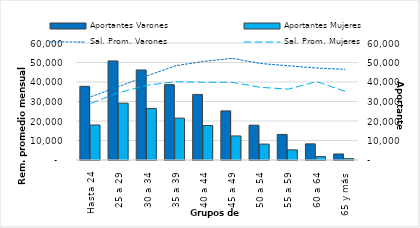
| Category | Aportantes Varones | Aportantes Mujeres |
|---|---|---|
| Hasta 24 | 37773 | 17953 |
| 25 a 29 | 50815 | 29146 |
| 30 a 34 | 46172 | 26453 |
| 35 a 39 | 38634 | 21482 |
| 40 a 44 | 33623 | 17686 |
| 45 a 49 | 25183 | 12333 |
| 50 a 54 | 17846 | 8159 |
| 55 a 59 | 13133 | 5185 |
| 60 a 64 | 8270 | 1747 |
| 65 y más | 3096 | 705 |